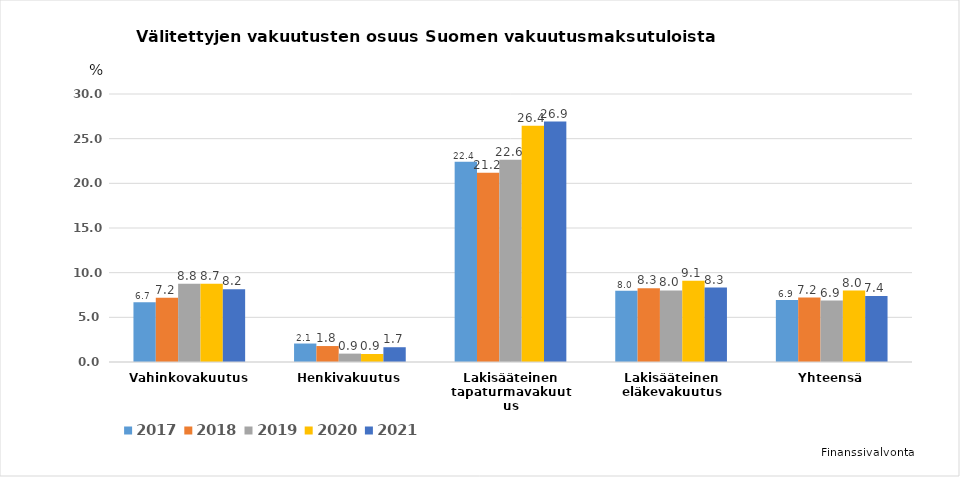
| Category | 2017 | 2018 | 2019 | 2020 | 2021 |
|---|---|---|---|---|---|
| Vahinkovakuutus | 6.681 | 7.184 | 8.751 | 8.75 | 8.151 |
| Henkivakuutus | 2.067 | 1.786 | 0.938 | 0.899 | 1.654 |
| Lakisääteinen tapaturmavakuutus | 22.408 | 21.186 | 22.632 | 26.436 | 26.92 |
| Lakisääteinen eläkevakuutus | 7.982 | 8.268 | 8.015 | 9.101 | 8.331 |
| Yhteensä | 6.948 | 7.208 | 6.878 | 8 | 7.377 |